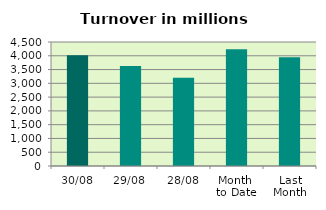
| Category | Series 0 |
|---|---|
| 30/08 | 4023.088 |
| 29/08 | 3626.643 |
| 28/08 | 3204.194 |
| Month 
to Date | 4240.294 |
| Last
Month | 3946.236 |